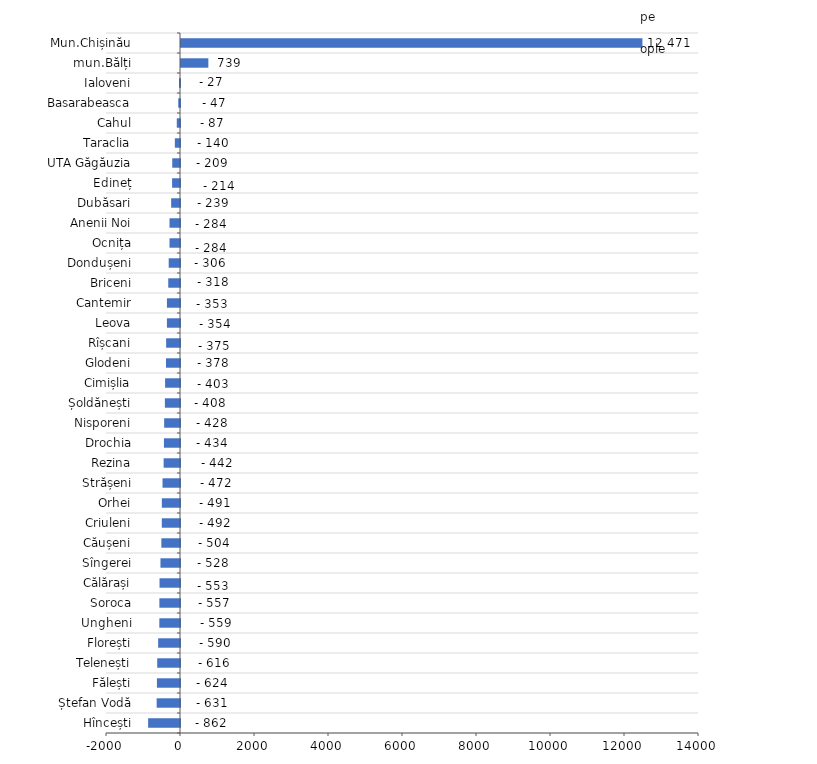
| Category | Series 0 |
|---|---|
| Mun.Chișinău | 12470.9 |
| mun.Bălți | 739.114 |
| Ialoveni | -26.566 |
| Basarabeasca | -47.344 |
| Cahul | -86.951 |
| Taraclia | -139.624 |
| UTA Găgăuzia | -209.474 |
| Edineț | -213.558 |
| Dubăsari | -239.028 |
| Anenii Noi | -283.789 |
| Ocnița | -283.9 |
| Dondușeni | -305.657 |
| Briceni | -317.837 |
| Cantemir | -353.359 |
| Leova | -353.937 |
| Rîșcani | -374.761 |
| Glodeni | -377.732 |
| Cimișlia | -402.664 |
| Șoldănești | -408.439 |
| Nisporeni | -428.309 |
| Drochia | -434.352 |
| Rezina | -442.376 |
| Strășeni | -472.291 |
| Orhei | -491.244 |
| Criuleni | -492.027 |
| Căușeni | -504.22 |
| Sîngerei | -528.022 |
| Călărași | -553.342 |
| Soroca | -557.306 |
| Ungheni | -558.719 |
| Florești | -590.44 |
| Telenești | -615.999 |
| Fălești | -623.947 |
| Ștefan Vodă | -631.14 |
| Hîncești | -861.664 |